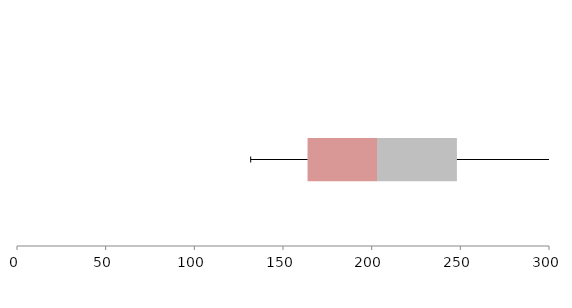
| Category | Series 1 | Series 2 | Series 3 |
|---|---|---|---|
| 0 | 163.85 | 39.163 | 45.051 |